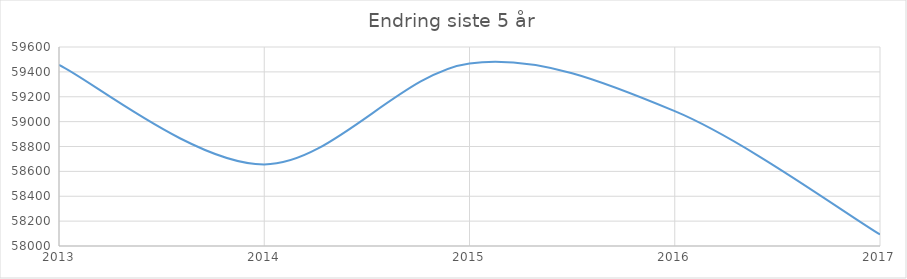
| Category | Series 0 |
|---|---|
| 2013.0 | 59456 |
| 2014.0 | 58656 |
| 2015.0 | 59468 |
| 2016.0 | 59084 |
| 2017.0 | 58093 |